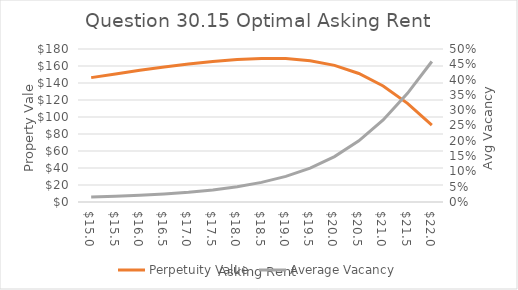
| Category | Perpetuity Value |
|---|---|
| 15.0 | 146.319 |
| 15.5 | 150.7 |
| 16.0 | 154.891 |
| 16.5 | 158.819 |
| 17.0 | 162.379 |
| 17.5 | 165.42 |
| 18.0 | 167.721 |
| 18.5 | 168.961 |
| 19.0 | 168.683 |
| 19.5 | 166.24 |
| 20.0 | 160.772 |
| 20.5 | 151.226 |
| 21.0 | 136.533 |
| 21.5 | 116.054 |
| 22.0 | 90.314 |